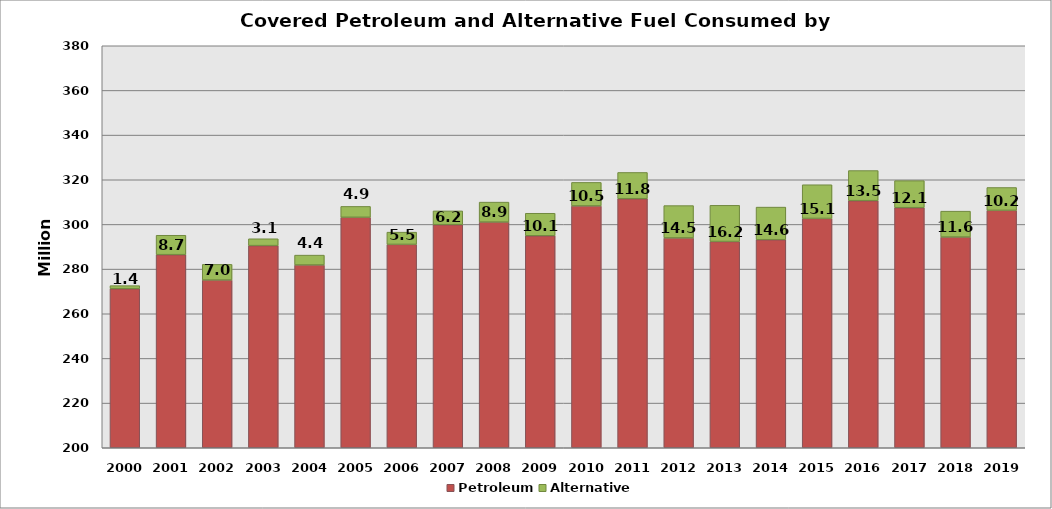
| Category |  Petroleum  | Alternative |
|---|---|---|
| 2000.0 | 271216176 | 1380837 |
| 2001.0 | 286457638 | 8696247 |
| 2002.0 | 275091679 | 7027164 |
| 2003.0 | 290506862 | 3073269 |
| 2004.0 | 281830103 | 4429460 |
| 2005.0 | 303188859 | 4879411 |
| 2006.0 | 291052076 | 5496332 |
| 2007.0 | 299876539 | 6186834 |
| 2008.0 | 301045891 | 8947801 |
| 2009.0 | 294913021 | 10093398 |
| 2010.0 | 308275507 | 10538475 |
| 2011.0 | 311511401 | 11759794 |
| 2012.0 | 293945538 | 14488408 |
| 2013.0 | 292338083 | 16217651 |
| 2014.0 | 293153365 | 14607813 |
| 2015.0 | 302673035 | 15100325 |
| 2016.0 | 310636590.527 | 13490718.34 |
| 2017.0 | 307496070.286 | 12106318.291 |
| 2018.0 | 294334847.601 | 11602918.747 |
| 2019.0 | 306304634.112 | 10225981.598 |